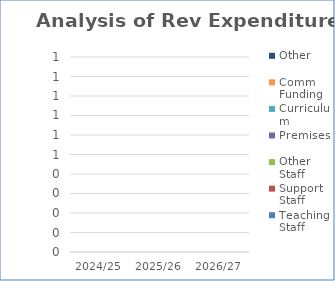
| Category | Teaching Staff | Support Staff | Other Staff | Premises | Curriculum | Comm Funding | Other |
|---|---|---|---|---|---|---|---|
| 2024/25 | 0 | 0 | 0 | 0 | 0 | 0 | 0 |
| 2025/26 | 0 | 0 | 0 | 0 | 0 | 0 | 0 |
| 2026/27 | 0 | 0 | 0 | 0 | 0 | 0 | 0 |